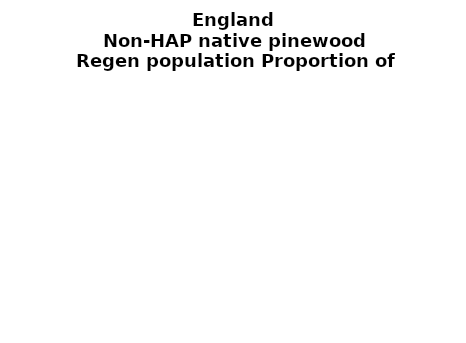
| Category | Non-HAP native pinewood |
|---|---|
| None | 0 |
| Seedlings only | 0 |
| Seedlings, saplings only | 0 |
| Seedlings, saplings, <7 cm trees | 0 |
| Saplings only | 0 |
| <7 cm trees, seedlings only | 0 |
| <7 cm trees, saplings only | 0 |
| <7 cm Trees only | 0 |